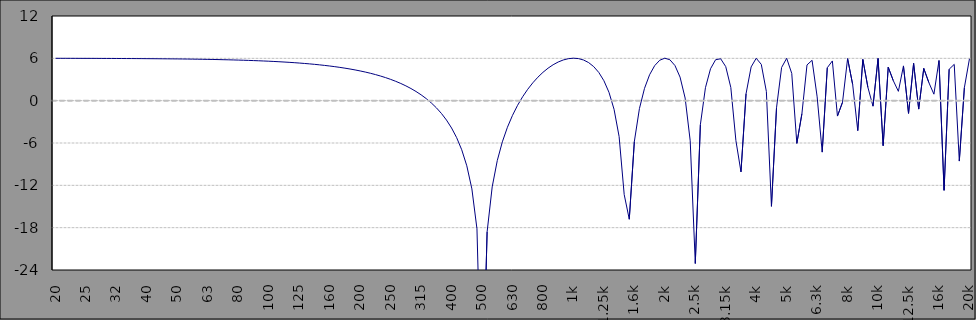
| Category | Series 0 |
|---|---|
| 20 | 6.004 |
| 20.78431373 | 6.003 |
| 21.59938485 | 6.001 |
| 22.44641955 | 6 |
| 23.3266713 | 5.998 |
| 24.24144272 | 5.996 |
| 25 | 5.994 |
| 26.18001254 | 5.992 |
| 27.2066797 | 5.99 |
| 28.27360831 | 5.987 |
| 29.38237726 | 5.985 |
| 30.53462735 | 5.982 |
| 31.5 | 5.979 |
| 32.97645838 | 5.975 |
| 34.26965282 | 5.972 |
| 35.61356077 | 5.968 |
| 37.010171 | 5.963 |
| 38.46155026 | 5.959 |
| 40 | 5.954 |
| 41.5372913 | 5.948 |
| 43.16620468 | 5.943 |
| 44.85899702 | 5.936 |
| 46.61817338 | 5.93 |
| 48.44633704 | 5.922 |
| 50 | 5.915 |
| 52.32055392 | 5.906 |
| 54.37234035 | 5.897 |
| 56.50458899 | 5.887 |
| 58.72045522 | 5.876 |
| 61.02321817 | 5.864 |
| 63 | 5.852 |
| 65.90319871 | 5.838 |
| 68.48763788 | 5.824 |
| 71.1734276 | 5.808 |
| 73.96454241 | 5.791 |
| 76.8651127 | 5.772 |
| 80 | 5.752 |
| 83.01195754 | 5.73 |
| 86.26732843 | 5.707 |
| 89.65036091 | 5.681 |
| 93.16606134 | 5.654 |
| 96.81963237 | 5.624 |
| 100 | 5.592 |
| 104.562225 | 5.557 |
| 108.6627045 | 5.519 |
| 112.923987 | 5.478 |
| 117.3523786 | 5.433 |
| 121.9544327 | 5.385 |
| 125 | 5.333 |
| 131.7070363 | 5.277 |
| 136.8720181 | 5.215 |
| 142.2395482 | 5.149 |
| 147.8175697 | 5.076 |
| 153.6143372 | 4.997 |
| 160 | 4.912 |
| 165.8987594 | 4.819 |
| 172.4045931 | 4.718 |
| 179.1655575 | 4.608 |
| 186.1916578 | 4.488 |
| 193.4932915 | 4.357 |
| 200 | 4.213 |
| 208.9668034 | 4.057 |
| 217.16158 | 3.886 |
| 225.6777204 | 3.698 |
| 234.5278271 | 3.492 |
| 243.7249968 | 3.266 |
| 250 | 3.017 |
| 263.2155002 | 2.741 |
| 273.5376767 | 2.437 |
| 284.2646444 | 2.099 |
| 295.4122775 | 1.722 |
| 306.9970727 | 1.301 |
| 315 | 0.829 |
| 331.5473961 | 0.295 |
| 344.5492547 | -0.311 |
| 358.0609902 | -1.006 |
| 372.1025977 | -1.81 |
| 386.6948564 | -2.751 |
| 400 | -3.873 |
| 417.6185512 | -5.24 |
| 433.9957493 | -6.96 |
| 451.0151904 | -9.234 |
| 468.7020606 | -12.506 |
| 487.0825336 | -18.162 |
| 500 | -45.518 |
| 526.0341549 | -18.59 |
| 546.6629453 | -12.22 |
| 568.1007079 | -8.494 |
| 590.379167 | -5.837 |
| 613.5312912 | -3.77 |
| 630 | -2.08 |
| 662.5949239 | -0.659 |
| 688.5790385 | 0.559 |
| 715.5821381 | 1.613 |
| 743.6441827 | 2.53 |
| 772.8066997 | 3.328 |
| 800 | 4.016 |
| 834.6074661 | 4.603 |
| 867.3371707 | 5.09 |
| 901.350393 | 5.48 |
| 936.6974673 | 5.769 |
| 973.4307013 | 5.952 |
| 1k | 6.02 |
| 1051.275217 | 5.963 |
| 1092.501696 | 5.762 |
| 1135.3449 | 5.393 |
| 1179.868229 | 4.821 |
| 1226.137572 | 3.994 |
| 1.25k | 2.828 |
| 1324.190865 | 1.183 |
| 1376.119918 | -1.225 |
| 1430.085405 | -5.089 |
| 1486.167186 | -13.306 |
| 1544.448252 | -16.807 |
| 1.6k | -5.781 |
| 1667.956609 | -1.123 |
| 1733.366672 | 1.744 |
| 1801.341836 | 3.672 |
| 1871.982692 | 4.962 |
| 1945.393778 | 5.732 |
| 2k | 6.019 |
| 2100.965445 | 5.798 |
| 2183.356247 | 4.975 |
| 2268.97806 | 3.339 |
| 2357.957592 | 0.372 |
| 2450.426517 | -5.693 |
| 2.5k | -23.077 |
| 2646.38527 | -3.409 |
| 2750.165084 | 1.838 |
| 2858.014695 | 4.522 |
| 2970.093703 | 5.802 |
| 3086.567966 | 5.938 |
| 3.15k | 4.827 |
| 3333.398468 | 1.869 |
| 3464.119977 | -5.655 |
| 3599.967819 | -10.094 |
| 3741.143028 | 0.985 |
| 3887.854519 | 4.78 |
| 4k | 6.01 |
| 4198.7633 | 5.146 |
| 4363.420685 | 1.297 |
| 4534.535221 | -14.977 |
| 4712.360132 | -1.004 |
| 4897.158569 | 4.705 |
| 5k | 6.006 |
| 5288.78063 | 3.859 |
| 5496.183792 | -6.054 |
| 5711.720411 | -1.849 |
| 5935.709447 | 5.064 |
| 6168.482367 | 5.723 |
| 6.3k | 0.541 |
| 6661.771229 | -7.292 |
| 6923.01716 | 4.668 |
| 7194.508029 | 5.631 |
| 7476.645599 | -2.182 |
| 7769.847387 | -0.225 |
| 8k | 5.96 |
| 8391.196198 | 2.281 |
| 8720.262715 | -4.247 |
| 9062.233802 | 5.846 |
| 9417.61552 | 1.877 |
| 9786.933776 | -0.781 |
| 10k | 5.983 |
| 10569.58746 | -6.376 |
| 10984.08108 | 4.744 |
| 11414.82936 | 2.833 |
| 11862.46973 | 1.321 |
| 12327.66462 | 4.925 |
| 12.5k | -1.798 |
| 13313.49862 | 5.291 |
| 13835.59661 | -1.194 |
| 14378.16902 | 4.576 |
| 14942.01879 | 2.569 |
| 15527.98031 | 0.919 |
| 16k | 5.691 |
| 16769.74113 | -12.707 |
| 17427.37804 | 4.455 |
| 18110.80463 | 5.144 |
| 18821.03226 | -8.56 |
| 19559.11196 | 1.853 |
| 20k | 5.937 |